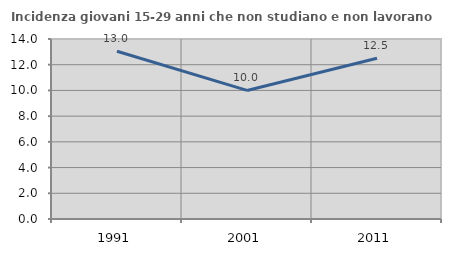
| Category | Incidenza giovani 15-29 anni che non studiano e non lavorano  |
|---|---|
| 1991.0 | 13.043 |
| 2001.0 | 10 |
| 2011.0 | 12.5 |